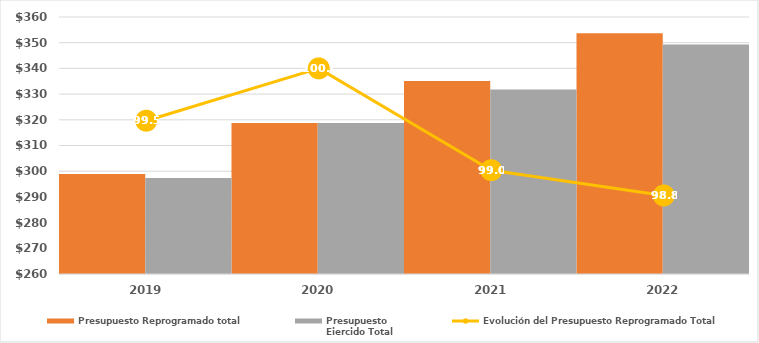
| Category | Presupuesto Reprogramado total | Presupuesto
Ejercido Total |
|---|---|---|
| 2019.0 | 298904.428 | 297383.7 |
| 2020.0 | 318785.247 | 318785.247 |
| 2021.0 | 335107.39 | 331789.211 |
| 2022.0 | 353691.561 | 349320.095 |